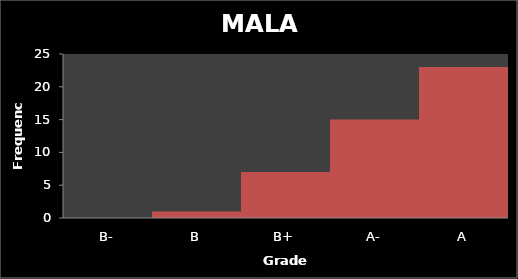
| Category | Series 0 |
|---|---|
| B- | 0 |
| B | 1 |
| B+ | 7 |
| A- | 15 |
| A | 23 |